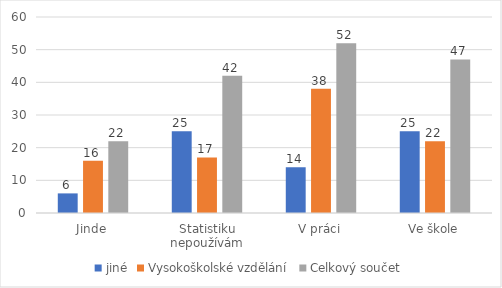
| Category | jiné | Vysokoškolské vzdělání | Celkový součet |
|---|---|---|---|
| Jinde | 6 | 16 | 22 |
| Statistiku nepoužívám | 25 | 17 | 42 |
| V práci | 14 | 38 | 52 |
| Ve škole | 25 | 22 | 47 |